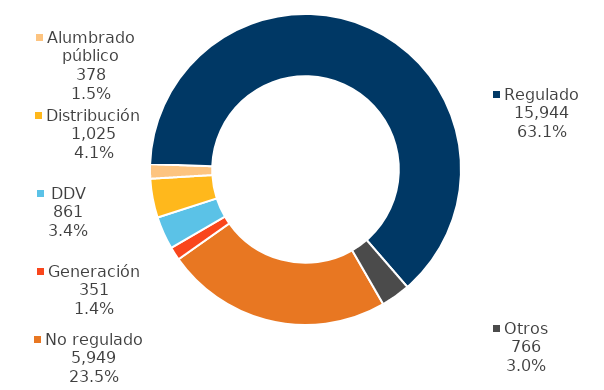
| Category | dic-2020 |
|---|---|
| No regulado | 5949 |
| Generación | 351 |
| DDV | 861 |
| Distribución | 1025 |
| Alumbrado público | 378 |
| Regulado | 15944 |
| Otros | 766 |